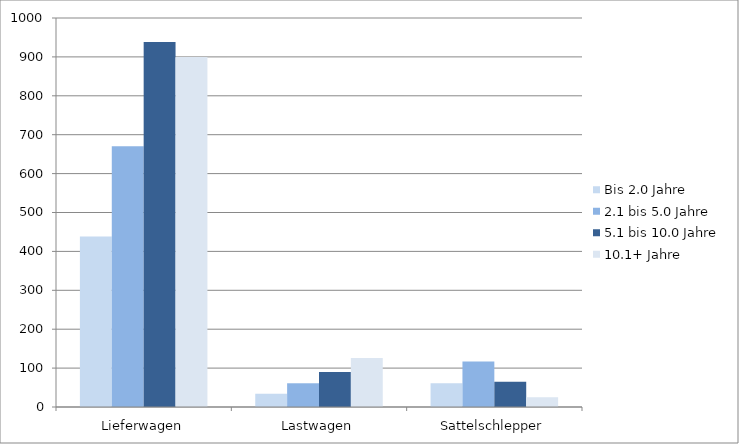
| Category | Bis 2.0 Jahre | 2.1 bis 5.0 Jahre | 5.1 bis 10.0 Jahre | 10.1+ Jahre |
|---|---|---|---|---|
| Lieferwagen | 438 | 670 | 938 | 900 |
| Lastwagen | 34 | 61 | 90 | 126 |
| Sattelschlepper | 61 | 117 | 65 | 25 |